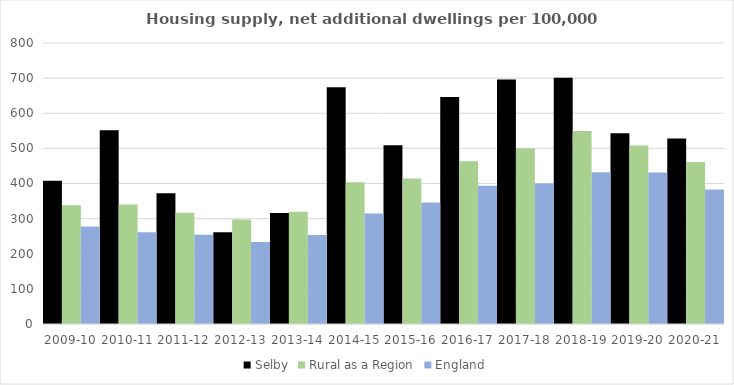
| Category | Selby | Rural as a Region | England |
|---|---|---|---|
| 2009-10 | 407.532 | 337.852 | 277.548 |
| 2010-11 | 551.567 | 340.105 | 260.994 |
| 2011-12 | 372.246 | 317.04 | 254.007 |
| 2012-13 | 261.286 | 297.763 | 233.153 |
| 2013-14 | 315.692 | 319.835 | 253.602 |
| 2014-15 | 673.892 | 403.796 | 314.256 |
| 2015-16 | 509.192 | 414.091 | 346.154 |
| 2016-17 | 646.408 | 463.209 | 393.256 |
| 2017-18 | 696.349 | 500.68 | 399.646 |
| 2018-19 | 701.412 | 549.491 | 432.099 |
| 2019-20 | 542.927 | 508.493 | 431.187 |
| 2020-21 | 527.825 | 461.114 | 382.827 |